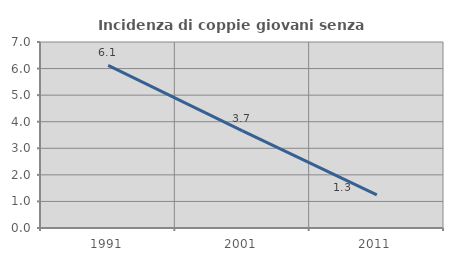
| Category | Incidenza di coppie giovani senza figli |
|---|---|
| 1991.0 | 6.122 |
| 2001.0 | 3.659 |
| 2011.0 | 1.25 |